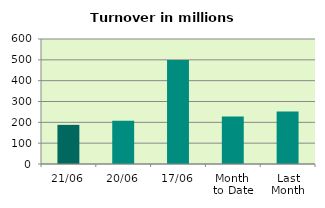
| Category | Series 0 |
|---|---|
| 21/06 | 187.873 |
| 20/06 | 207.974 |
| 17/06 | 499.478 |
| Month 
to Date | 227.933 |
| Last
Month | 251.573 |